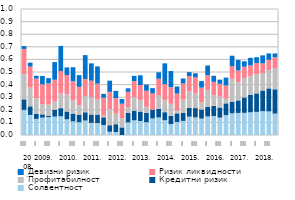
| Category | Солвентност | Кредитни ризик | Профитабилност | Ризик ликвидности | Девизни ризик |
|---|---|---|---|---|---|
| 0 | 0.2 | 0.083 | 0.2 | 0.2 | 0.023 |
| 1 | 0.159 | 0.068 | 0.148 | 0.167 | 0.031 |
| 2 | 0.128 | 0.041 | 0.124 | 0.155 | 0.022 |
| 3 | 0.138 | 0.026 | 0.081 | 0.157 | 0.066 |
| 4 | 0.142 | 0.01 | 0.09 | 0.167 | 0.042 |
| 5 | 0.146 | 0.052 | 0.071 | 0.17 | 0.14 |
| 6 | 0.149 | 0.064 | 0.117 | 0.177 | 0.2 |
| 7 | 0.125 | 0.062 | 0.136 | 0.153 | 0.061 |
| 8 | 0.108 | 0.062 | 0.106 | 0.15 | 0.112 |
| 9 | 0.102 | 0.06 | 0.075 | 0.145 | 0.093 |
| 10 | 0.115 | 0.066 | 0.129 | 0.135 | 0.189 |
| 11 | 0.097 | 0.066 | 0.137 | 0.131 | 0.137 |
| 12 | 0.094 | 0.068 | 0.118 | 0.127 | 0.137 |
| 13 | 0.079 | 0.062 | 0.014 | 0.142 | 0.031 |
| 14 | 0.026 | 0.052 | 0.128 | 0.137 | 0.089 |
| 15 | 0.023 | 0.062 | 0.083 | 0.123 | 0.058 |
| 16 | 0 | 0.061 | 0.072 | 0.115 | 0.037 |
| 17 | 0.101 | 0.074 | 0.047 | 0.121 | 0.028 |
| 18 | 0.117 | 0.077 | 0.107 | 0.127 | 0.041 |
| 19 | 0.111 | 0.075 | 0.09 | 0.121 | 0.077 |
| 20 | 0.102 | 0.073 | 0.049 | 0.127 | 0.049 |
| 21 | 0.132 | 0.068 | 0 | 0.13 | 0.042 |
| 22 | 0.139 | 0.068 | 0.104 | 0.134 | 0.052 |
| 23 | 0.117 | 0.064 | 0.096 | 0.127 | 0.165 |
| 24 | 0.086 | 0.065 | 0.096 | 0.132 | 0.128 |
| 25 | 0.103 | 0.069 | 0.023 | 0.134 | 0.056 |
| 26 | 0.112 | 0.066 | 0.103 | 0.128 | 0.04 |
| 27 | 0.145 | 0.069 | 0.131 | 0.123 | 0.031 |
| 28 | 0.14 | 0.074 | 0.118 | 0.125 | 0.033 |
| 29 | 0.13 | 0.072 | 0.054 | 0.119 | 0.052 |
| 30 | 0.147 | 0.078 | 0.132 | 0.117 | 0.077 |
| 31 | 0.151 | 0.08 | 0.085 | 0.106 | 0.048 |
| 32 | 0.138 | 0.081 | 0.086 | 0.102 | 0.033 |
| 33 | 0.158 | 0.094 | 0.036 | 0.105 | 0.063 |
| 34 | 0.172 | 0.093 | 0.182 | 0.099 | 0.083 |
| 35 | 0.175 | 0.099 | 0.146 | 0.092 | 0.083 |
| 36 | 0.176 | 0.122 | 0.154 | 0.09 | 0.043 |
| 37 | 0.18 | 0.14 | 0.148 | 0.084 | 0.061 |
| 38 | 0.183 | 0.147 | 0.153 | 0.089 | 0.046 |
| 39 | 0.189 | 0.164 | 0.138 | 0.077 | 0.064 |
| 40 | 0.187 | 0.183 | 0.145 | 0.082 | 0.05 |
| 41 | 0.17 | 0.193 | 0.169 | 0.085 | 0.03 |